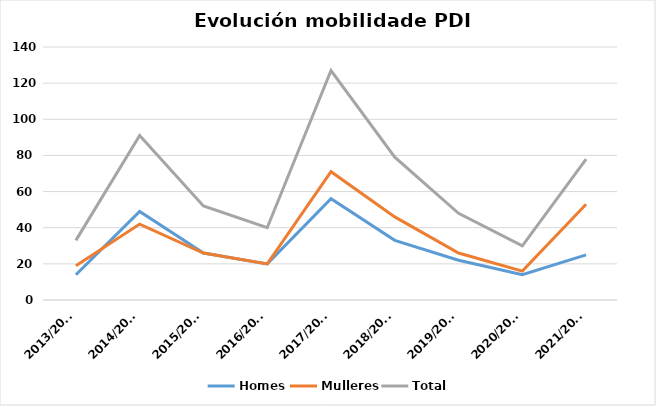
| Category | Homes | Mulleres | Total |
|---|---|---|---|
| 2013/2014 | 14 | 19 | 33 |
| 2014/2015 | 49 | 42 | 91 |
| 2015/2016 | 26 | 26 | 52 |
| 2016/2017 | 20 | 20 | 40 |
| 2017/2018 | 56 | 71 | 127 |
| 2018/2019 | 33 | 46 | 79 |
| 2019/2020 | 22 | 26 | 48 |
| 2020/2021 | 14 | 16 | 30 |
| 2021/2022 | 25 | 53 | 78 |